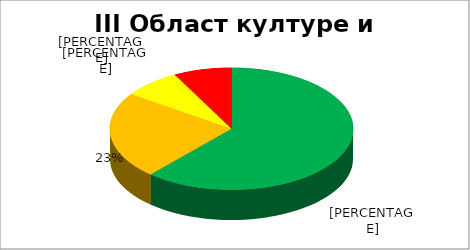
| Category | III Област културе и мeдија |
|---|---|
| 0 | 0.615 |
| 1 | 0.231 |
| 2 | 0.077 |
| 3 | 0.077 |
| 4 | 0 |